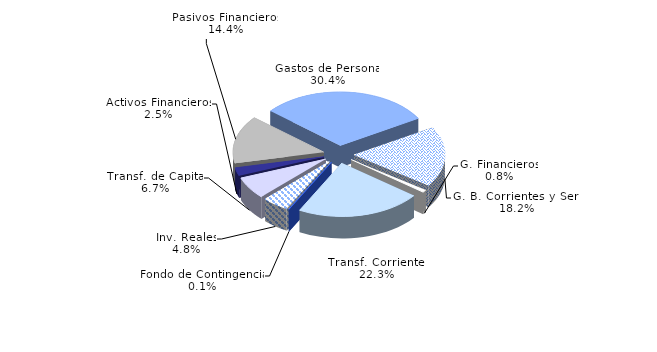
| Category | Series 0 |
|---|---|
| Gastos de Personal | 30.396 |
| G. B. Corrientes y Serv. | 18.159 |
| G. Financieros | 0.772 |
| Transf. Corrientes | 22.287 |
| Fondo de Contingencia | 0.068 |
| Inv. Reales | 4.757 |
| Transf. de Capital | 6.667 |
| Activos Financieros | 2.454 |
| Pasivos Financieros | 14.44 |